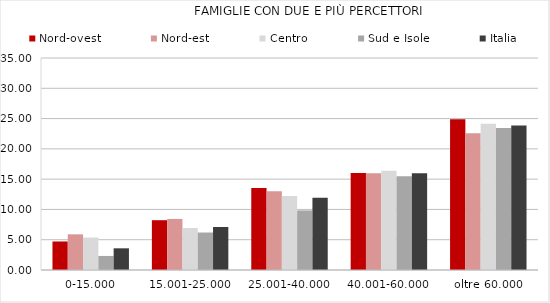
| Category | Nord-ovest | Nord-est | Centro | Sud e Isole | Italia |
|---|---|---|---|---|---|
| 0-15.000 | 4.71 | 5.89 | 5.36 | 2.32 | 3.58 |
| 15.001-25.000 | 8.22 | 8.43 | 6.93 | 6.19 | 7.1 |
| 25.001-40.000 | 13.52 | 13 | 12.23 | 9.84 | 11.93 |
| 40.001-60.000 | 16.03 | 15.98 | 16.39 | 15.49 | 15.97 |
| oltre 60.000 | 24.88 | 22.57 | 24.13 | 23.44 | 23.87 |